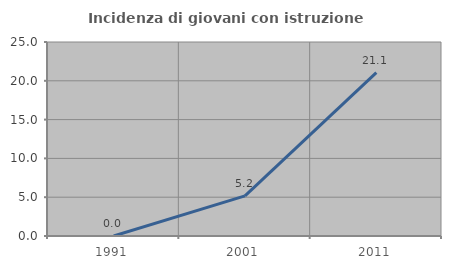
| Category | Incidenza di giovani con istruzione universitaria |
|---|---|
| 1991.0 | 0 |
| 2001.0 | 5.172 |
| 2011.0 | 21.053 |